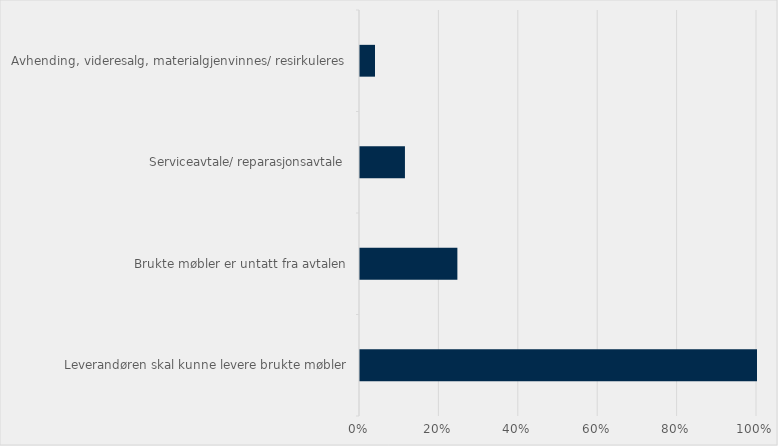
| Category | Prosentvis andel  anskaffelser som har stilt kr |
|---|---|
| Leverandøren skal kunne levere brukte møbler | 1 |
| Brukte møbler er untatt fra avtalen | 0.245 |
| Serviceavtale/ reparasjonsavtale | 0.113 |
| Avhending, videresalg, materialgjenvinnes/ resirkuleres | 0.038 |